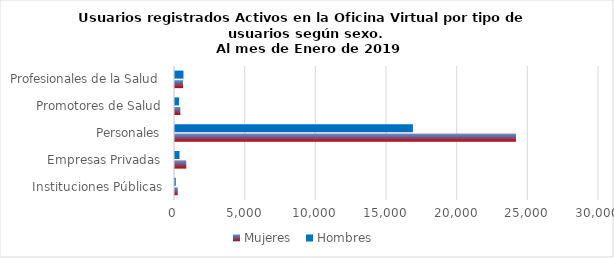
| Category | Mujeres | Hombres |
|---|---|---|
| Instituciones Públicas | 193 | 54 |
| Empresas Privadas | 799 | 319 |
| Personales | 24125 | 16833 |
| Promotores de Salud | 377 | 280 |
| Profesionales de la Salud | 565 | 599 |